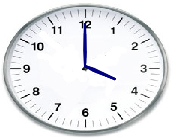
| Category | Series 0 |
|---|---|
| 0.0 | 0 |
| 0.23179596364169683 | -0.094 |
| 0.7794228634059945 | -0.45 |
| 0.1970026884016805 | -0.154 |
| 0.0 | 0 |
| 0.2246985115747917 | -0.11 |
| 0.7794228634059945 | -0.45 |
| 0.20725939313876035 | -0.14 |
| 0.0 | 0 |
| -0.017449748351250367 | 0.5 |
| 8.882326298087495e-17 | 1.45 |
| -0.008726203218641738 | 0.5 |
| 0.0 | 0 |
| 0.01744974835125054 | 0.5 |
| 8.882326298087495e-17 | 1.45 |
| 0.0087262032186418 | 0.5 |
| 0.0 | 0 |